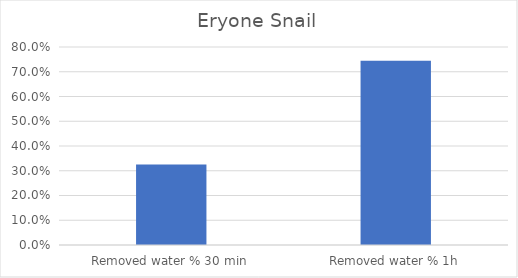
| Category | Eryone Snail |
|---|---|
| Removed water % 30 min | 0.326 |
| Removed water % 1h | 0.745 |